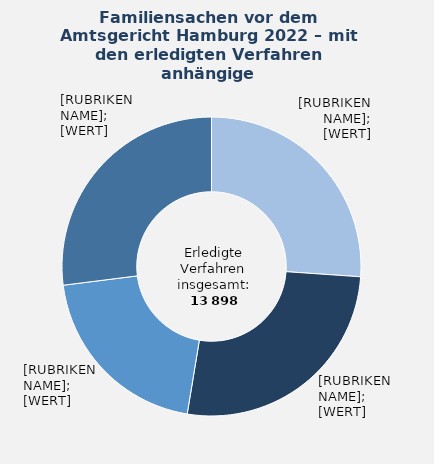
| Category | in Prozent |
|---|---|
| Versorgungsausgleich | 26.1 |
| Scheidung | 26.5 |
| Elterliche Sorge | 20.4 |
| Übrige Verfahrensgegenstände¹  | 27 |